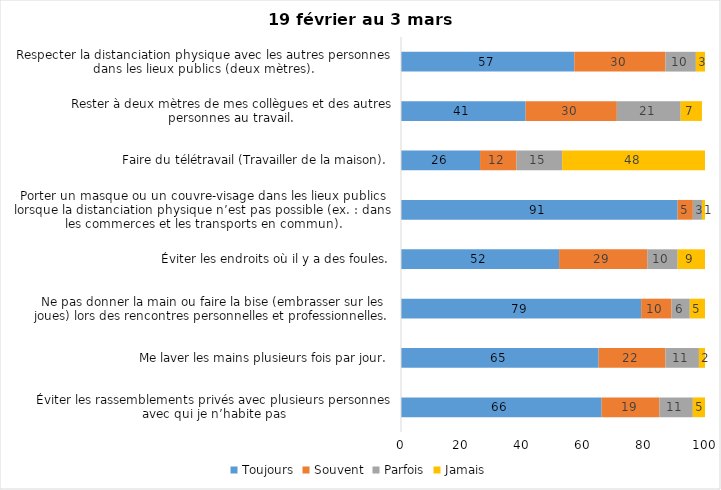
| Category | Toujours | Souvent | Parfois | Jamais |
|---|---|---|---|---|
| Éviter les rassemblements privés avec plusieurs personnes avec qui je n’habite pas | 66 | 19 | 11 | 5 |
| Me laver les mains plusieurs fois par jour. | 65 | 22 | 11 | 2 |
| Ne pas donner la main ou faire la bise (embrasser sur les joues) lors des rencontres personnelles et professionnelles. | 79 | 10 | 6 | 5 |
| Éviter les endroits où il y a des foules. | 52 | 29 | 10 | 9 |
| Porter un masque ou un couvre-visage dans les lieux publics lorsque la distanciation physique n’est pas possible (ex. : dans les commerces et les transports en commun). | 91 | 5 | 3 | 1 |
| Faire du télétravail (Travailler de la maison). | 26 | 12 | 15 | 48 |
| Rester à deux mètres de mes collègues et des autres personnes au travail. | 41 | 30 | 21 | 7 |
| Respecter la distanciation physique avec les autres personnes dans les lieux publics (deux mètres). | 57 | 30 | 10 | 3 |